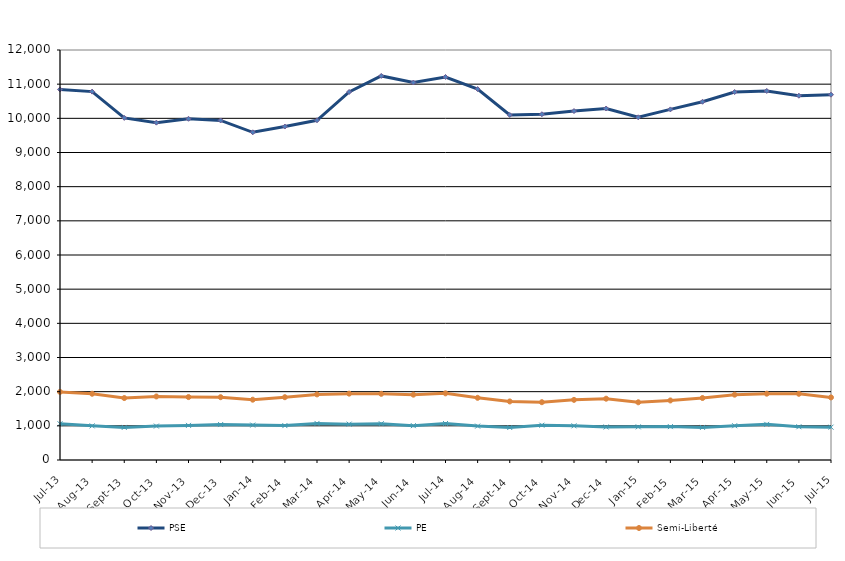
| Category | PSE | PE | Semi-Liberté |
|---|---|---|---|
| 2013-07-01 | 10846 | 1061 | 1993 |
| 2013-08-01 | 10782 | 999 | 1939 |
| 2013-09-01 | 10013 | 954 | 1813 |
| 2013-10-01 | 9874 | 993 | 1860 |
| 2013-11-01 | 9987 | 1013 | 1842 |
| 2013-12-01 | 9938 | 1037 | 1838 |
| 2014-01-01 | 9591 | 1022 | 1765 |
| 2014-02-01 | 9760 | 1007 | 1838 |
| 2014-03-01 | 9943 | 1071 | 1920 |
| 2014-04-01 | 10773 | 1050 | 1942 |
| 2014-05-01 | 11241 | 1062 | 1937 |
| 2014-06-01 | 11048 | 1005 | 1912 |
| 2014-07-01 | 11210 | 1068 | 1951 |
| 2014-08-01 | 10856 | 992 | 1820 |
| 2014-09-01 | 10098 | 951 | 1714 |
| 2014-10-01 | 10120 | 1018 | 1692 |
| 2014-11-01 | 10213 | 1000 | 1760 |
| 2014-12-01 | 10287 | 966 | 1794 |
| 2015-01-01 | 10030 | 970 | 1689 |
| 2015-02-01 | 10261 | 977 | 1743 |
| 2015-03-01 | 10485 | 954 | 1814 |
| 2015-04-01 | 10770 | 1003 | 1912 |
| 2015-05-01 | 10801 | 1043 | 1941 |
| 2015-06-01 | 10662 | 973 | 1938 |
| 2015-07-01 | 10692 | 961 | 1832 |